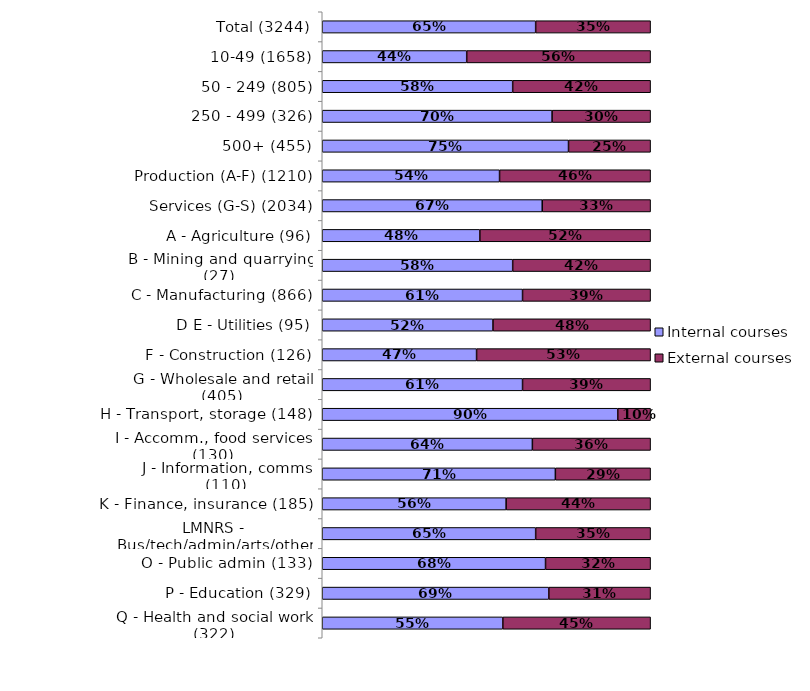
| Category | Internal courses | External courses |
|---|---|---|
| Total (3244) | 0.65 | 0.35 |
| 10-49 (1658) | 0.44 | 0.56 |
| 50 - 249 (805) | 0.58 | 0.42 |
| 250 - 499 (326) | 0.7 | 0.3 |
| 500+ (455) | 0.75 | 0.25 |
| Production (A-F) (1210) | 0.54 | 0.46 |
| Services (G-S) (2034) | 0.67 | 0.33 |
| A - Agriculture (96) | 0.48 | 0.52 |
| B - Mining and quarrying (27) | 0.58 | 0.42 |
| C - Manufacturing (866) | 0.61 | 0.39 |
| D E - Utilities (95) | 0.52 | 0.48 |
| F - Construction (126) | 0.47 | 0.53 |
| G - Wholesale and retail (405) | 0.61 | 0.39 |
| H - Transport, storage (148) | 0.9 | 0.1 |
| I - Accomm., food services (130) | 0.64 | 0.36 |
| J - Information, comms (110) | 0.71 | 0.29 |
| K - Finance, insurance (185) | 0.56 | 0.44 |
| LMNRS - Bus/tech/admin/arts/other (272) | 0.65 | 0.35 |
| O - Public admin (133) | 0.68 | 0.32 |
| P - Education (329) | 0.69 | 0.31 |
| Q - Health and social work (322) | 0.55 | 0.45 |